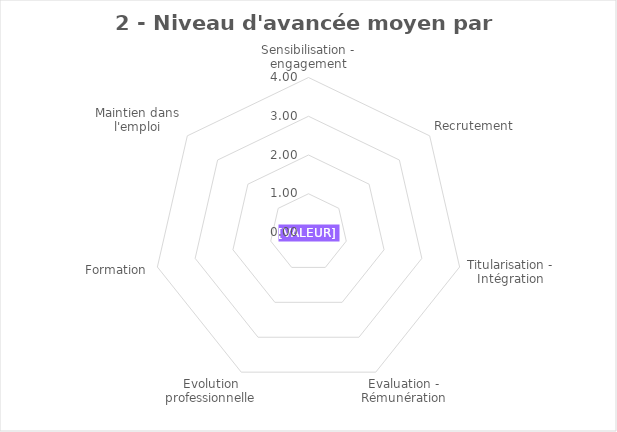
| Category | Series 0 |
|---|---|
| Sensibilisation - engagement | 0 |
| Recrutement | 0 |
| Titularisation - Intégration | 0 |
| Evaluation - Rémunération | 0 |
| Evolution professionnelle | 0 |
| Formation | 0 |
| Maintien dans l'emploi | 0 |